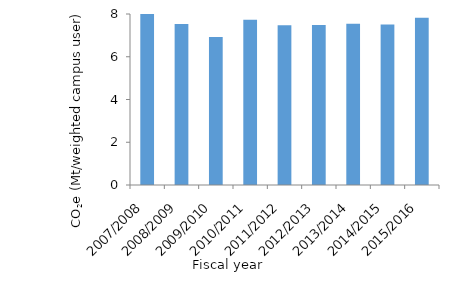
| Category | Series 0 |
|---|---|
| 2007/2008 | 8.032 |
| 2008/2009 | 7.535 |
| 2009/2010 | 6.921 |
| 2010/2011 | 7.733 |
| 2011/2012 | 7.47 |
| 2012/2013 | 7.481 |
| 2013/2014 | 7.546 |
| 2014/2015 | 7.505 |
| 2015/2016 | 7.824 |